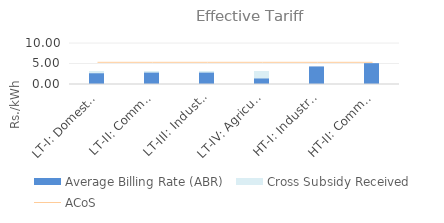
| Category | Average Billing Rate (ABR) | Cross Subsidy Received |
|---|---|---|
| LT-I: Domestic | 2.857 | 0.317 |
| LT-II: Commercial | 3.016 | 0.159 |
| LT-III: Industrial | 3.016 | 0.159 |
| LT-IV: Agricultural | 1.587 | 1.587 |
| HT-I: Industrial | 4.286 | 0 |
| HT-II: Commercial | 5.079 | 0 |